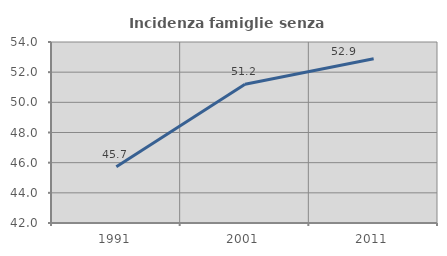
| Category | Incidenza famiglie senza nuclei |
|---|---|
| 1991.0 | 45.736 |
| 2001.0 | 51.2 |
| 2011.0 | 52.893 |